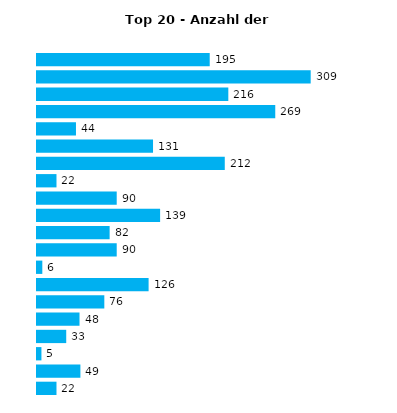
| Category | Series 0 |
|---|---|
| 0 | 195 |
| 1 | 309 |
| 2 | 216 |
| 3 | 269 |
| 4 | 44 |
| 5 | 131 |
| 6 | 212 |
| 7 | 22 |
| 8 | 90 |
| 9 | 139 |
| 10 | 82 |
| 11 | 90 |
| 12 | 6 |
| 13 | 126 |
| 14 | 76 |
| 15 | 48 |
| 16 | 33 |
| 17 | 5 |
| 18 | 49 |
| 19 | 22 |